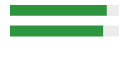
| Category | Series 0 | Series 1 |
|---|---|---|
| 0 | 0.889 | 0.111 |
| 1 | 0.857 | 0.143 |
| 2 | 0 | 0 |